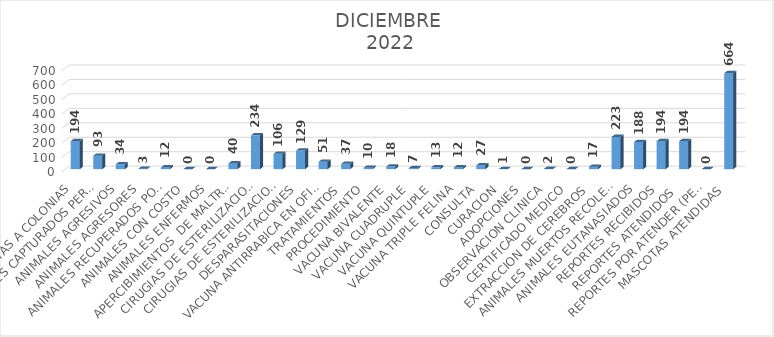
| Category | Series 0 |
|---|---|
| VISITAS A COLONIAS | 194 |
| ANIMALES CAPTURADOS PERROS Y GATOS  | 93 |
| ANIMALES AGRESIVOS | 34 |
| ANIMALES AGRESORES | 3 |
| ANIMALES RECUPERADOS POR SUS DUEÑOS | 12 |
| ANIMALES CON COSTO | 0 |
| ANIMALES ENFERMOS | 0 |
| APERCIBIMIENTOS  DE MALTRATO ANIMAL | 40 |
| CIRUGIAS DE ESTERILIZACION (OVH) hembra | 234 |
| CIRUGIAS DE ESTERILIZACION (ORQ) macho | 106 |
| DESPARASITACIONES | 129 |
| VACUNA ANTIRRABICA EN OFICINA Y CAMPAÑAS PASEOS DEL PRADO Y FOVISSSTE MIRAVALLE | 51 |
| TRATAMIENTOS | 37 |
| PROCEDIMIENTO | 10 |
| VACUNA BIVALENTE | 18 |
| VACUNA CUADRUPLE | 7 |
| VACUNA QUINTUPLE | 13 |
| VACUNA TRIPLE FELINA | 12 |
| CONSULTA | 27 |
| CURACION | 1 |
| ADOPCIONES | 0 |
| OBSERVACION CLINICA | 2 |
| CERTIFICADO MEDICO | 0 |
| EXTRACCION DE CEREBROS | 17 |
| ANIMALES MUERTOS RECOLECTADOS | 223 |
| ANIMALES EUTANASIADOS | 188 |
| REPORTES RECIBIDOS | 194 |
| REPORTES ATENDIDOS  | 194 |
| REPORTES POR ATENDER (PENDIENTES) | 0 |
| MASCOTAS ATENDIDAS | 664 |